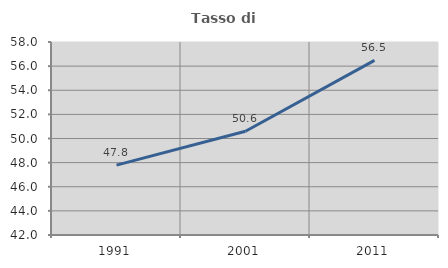
| Category | Tasso di occupazione   |
|---|---|
| 1991.0 | 47.795 |
| 2001.0 | 50.6 |
| 2011.0 | 56.48 |